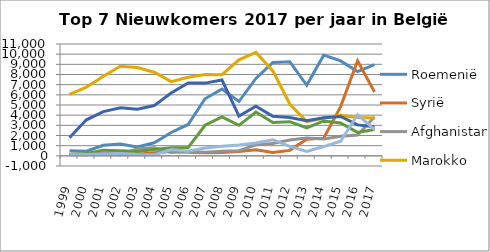
| Category | Roemenië | Syrië | Afghanistan | Marokko | Nederland | Bulgarije | Irak |
|---|---|---|---|---|---|---|---|
| 1999.0 | 490 | 141 | 119 | 6035 | 1784 | 154 | 115 |
| 2000.0 | 460 | 108 | 129 | 6752 | 3542 | 235 | 140 |
| 2001.0 | 1038 | 225 | 312 | 7835 | 4349 | 559 | 171 |
| 2002.0 | 1165 | 189 | 91 | 8816 | 4728 | 507 | 232 |
| 2003.0 | 873 | 153 | 686 | 8695 | 4579 | 421 | 126 |
| 2004.0 | 1281 | 303 | 786 | 8220 | 4943 | 634 | 83 |
| 2005.0 | 2297 | 415 | 338 | 7299 | 6186 | 798 | 621 |
| 2006.0 | 3084 | 358 | 462 | 7731 | 7170 | 811 | 447 |
| 2007.0 | 5612 | 312 | 350 | 8003 | 7152 | 3008 | 775 |
| 2008.0 | 6573 | 333 | 447 | 7986 | 7459 | 3820 | 945 |
| 2009.0 | 5342 | 414 | 509 | 9436 | 3914 | 2999 | 1067 |
| 2010.0 | 7612 | 588 | 1079 | 10172 | 4885 | 4312 | 1272 |
| 2011.0 | 9178 | 321 | 1214 | 8354 | 3893 | 3276 | 1584 |
| 2012.0 | 9261 | 537 | 1560 | 5095 | 3760 | 3357 | 934 |
| 2013.0 | 6937 | 1634 | 1749 | 3376 | 3450 | 2748 | 441 |
| 2014.0 | 9904 | 1742 | 1659 | 3697 | 3749 | 3428 | 912 |
| 2015.0 | 9341 | 4843 | 1919 | 3978 | 3878 | 3228 | 1438 |
| 2016.0 | 8287 | 9349 | 2044 | 3765 | 3042 | 2308 | 4042 |
| 2017.0 | 8978 | 6274 | 3824 | 3713 | 2871 | 2584 | 2574 |